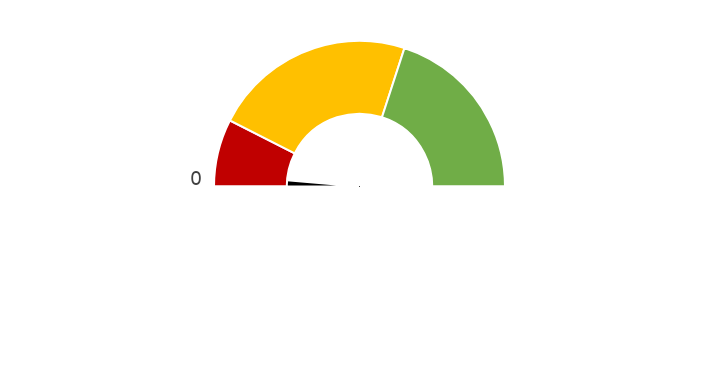
| Category | Pointer |
|---|---|
| 0 | 0 |
| 1 | 3 |
| 2 | 216 |